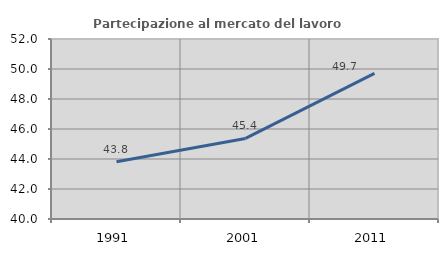
| Category | Partecipazione al mercato del lavoro  femminile |
|---|---|
| 1991.0 | 43.818 |
| 2001.0 | 45.37 |
| 2011.0 | 49.705 |